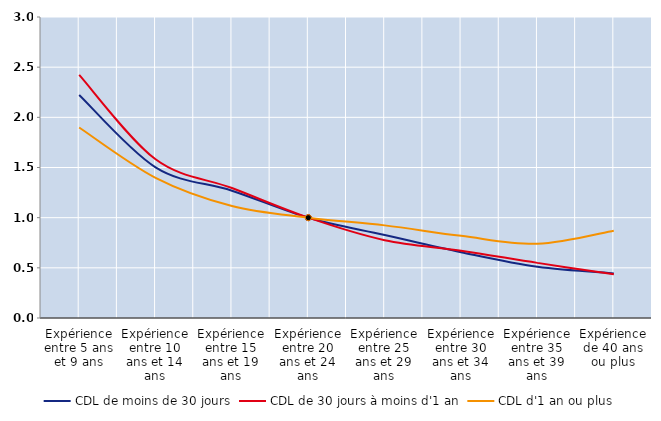
| Category | CDL de moins de 30 jours | CDL de 30 jours à moins d'1 an | CDL d'1 an ou plus |
|---|---|---|---|
| Expérience entre 5 ans et 9 ans | 2.223 | 2.422 | 1.899 |
| Expérience entre 10 ans et 14 ans | 1.502 | 1.582 | 1.397 |
| Expérience entre 15 ans et 19 ans | 1.269 | 1.295 | 1.116 |
| Expérience entre 20 ans et 24 ans | 1 | 1 | 1 |
| Expérience entre 25 ans et 29 ans | 0.827 | 0.776 | 0.923 |
| Expérience entre 30 ans et 34 ans | 0.656 | 0.671 | 0.819 |
| Expérience entre 35 ans et 39 ans | 0.51 | 0.549 | 0.74 |
| Expérience de 40 ans ou plus | 0.445 | 0.435 | 0.87 |